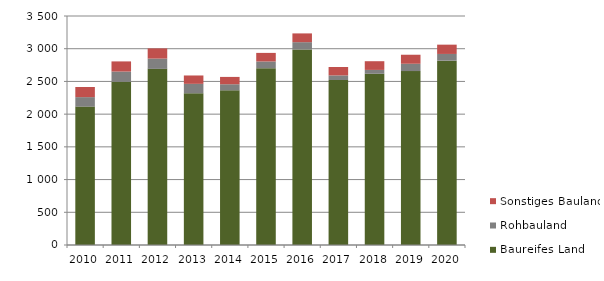
| Category | Baureifes Land | Rohbauland | Sonstiges Bauland |
|---|---|---|---|
| 2010.0 | 2115 | 145 | 155 |
| 2011.0 | 2496 | 155 | 155 |
| 2012.0 | 2692 | 157 | 156 |
| 2013.0 | 2319 | 144 | 128 |
| 2014.0 | 2364 | 93 | 112 |
| 2015.0 | 2703 | 102 | 131 |
| 2016.0 | 2989 | 111 | 134 |
| 2017.0 | 2522 | 70 | 129 |
| 2018.0 | 2617 | 59 | 133 |
| 2019.0 | 2658 | 112 | 138 |
| 2020.0 | 2817 | 103 | 142 |